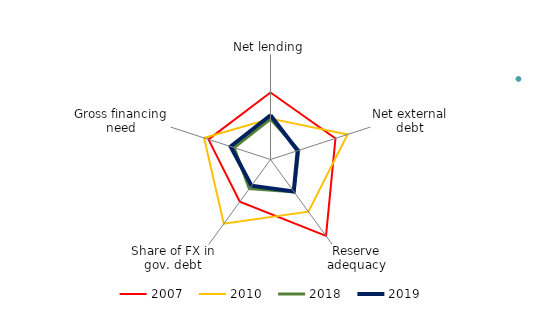
| Category | 2007 | 2008 | 2010 | 2018 | 2019 |
|---|---|---|---|---|---|
| Net lending | 0.83 |  | -0.665 | -0.687 | -0.471 |
| Net external debt | 0.904 |  | 1.632 | -1.301 | -1.366 |
| Reserve adequacy | 2.397 |  | 0.683 | -0.713 | -0.743 |
| Share of FX in gov. debt | -0.015 |  | 1.538 | -0.941 | -1.15 |
| Gross financing need | 0.727 |  | 0.991 | -0.816 | -0.603 |